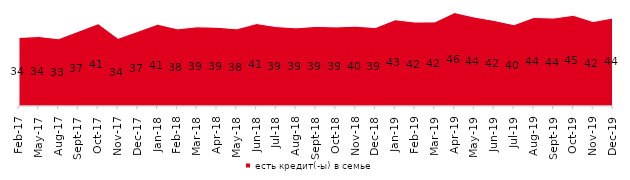
| Category | есть кредит(-ы) в семье |
|---|---|
| 2017-02-01 | 33.95 |
| 2017-05-01 | 34.4 |
| 2017-08-01 | 33.3 |
| 2017-09-01 | 37 |
| 2017-10-01 | 40.75 |
| 2017-11-01 | 33.5 |
| 2017-12-01 | 36.95 |
| 2018-01-01 | 40.5 |
| 2018-02-01 | 38.2 |
| 2018-03-01 | 39.2 |
| 2018-04-01 | 39 |
| 2018-05-01 | 38.2 |
| 2018-06-01 | 40.8 |
| 2018-07-01 | 39.3 |
| 2018-08-01 | 38.7 |
| 2018-09-01 | 39.4 |
| 2018-10-01 | 39.15 |
| 2018-11-01 | 39.521 |
| 2018-12-01 | 38.8 |
| 2019-01-01 | 42.7 |
| 2019-02-01 | 41.55 |
| 2019-03-01 | 41.621 |
| 2019-04-01 | 46.238 |
| 2019-05-01 | 44.032 |
| 2019-06-01 | 42.344 |
| 2019-07-01 | 40.248 |
| 2019-08-01 | 43.856 |
| 2019-09-01 | 43.515 |
| 2019-10-01 | 44.901 |
| 2019-11-01 | 41.782 |
| 2019-12-01 | 43.614 |